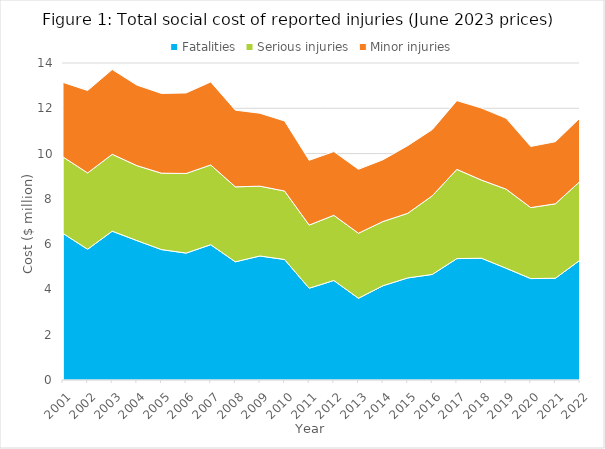
| Category | Fatalities | Serious injuries | Minor injuries |
|---|---|---|---|
| 2001.0 | 6.473 | 3.379 | 3.292 |
| 2002.0 | 5.775 | 3.37 | 3.642 |
| 2003.0 | 6.573 | 3.395 | 3.744 |
| 2004.0 | 6.159 | 3.309 | 3.555 |
| 2005.0 | 5.76 | 3.374 | 3.522 |
| 2006.0 | 5.604 | 3.517 | 3.557 |
| 2007.0 | 5.975 | 3.524 | 3.664 |
| 2008.0 | 5.22 | 3.311 | 3.387 |
| 2009.0 | 5.478 | 3.082 | 3.222 |
| 2010.0 | 5.322 | 3.024 | 3.093 |
| 2011.0 | 4.053 | 2.79 | 2.858 |
| 2012.0 | 4.395 | 2.878 | 2.814 |
| 2013.0 | 3.61 | 2.873 | 2.824 |
| 2014.0 | 4.165 | 2.836 | 2.727 |
| 2015.0 | 4.507 | 2.854 | 2.986 |
| 2016.0 | 4.663 | 3.472 | 2.922 |
| 2017.0 | 5.362 | 3.94 | 3.036 |
| 2018.0 | 5.378 | 3.451 | 3.18 |
| 2019.0 | 4.936 | 3.493 | 3.129 |
| 2020.0 | 4.479 | 3.135 | 2.699 |
| 2021.0 | 4.494 | 3.288 | 2.741 |
| 2022.0 | 5.293 | 3.479 | 2.803 |